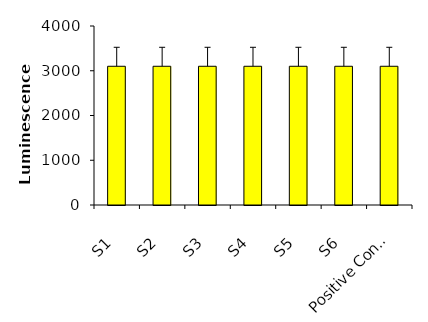
| Category | Series 0 |
|---|---|
| S1 | 3100 |
| S2 | 3100 |
| S3 | 3100 |
| S4 | 3100 |
| S5 | 3100 |
| S6 | 3100 |
| Positive Control | 3100 |